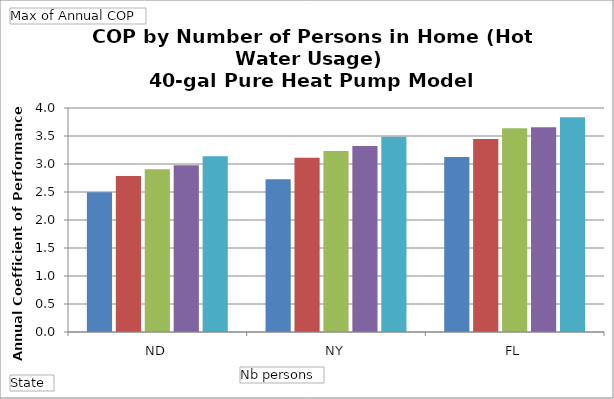
| Category | 1 | 2 | 3 | 4 | 5+ |
|---|---|---|---|---|---|
| ND | 2.494 | 2.786 | 2.907 | 2.977 | 3.14 |
| NY | 2.728 | 3.112 | 3.234 | 3.322 | 3.486 |
| FL | 3.127 | 3.447 | 3.637 | 3.657 | 3.835 |